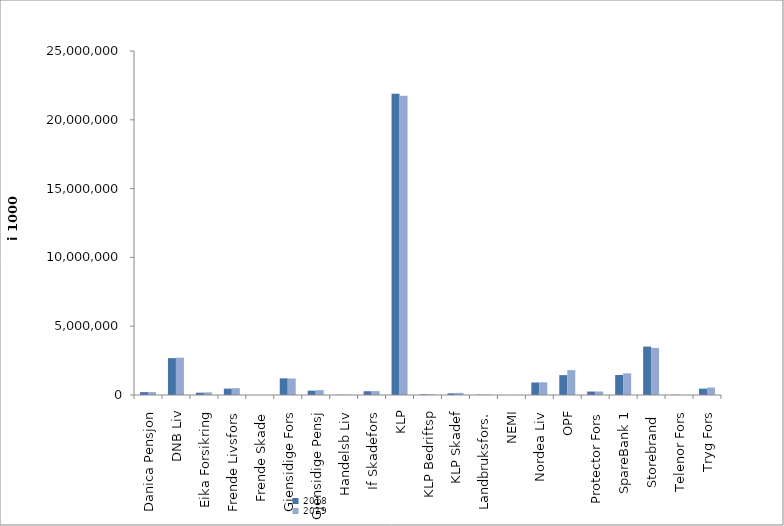
| Category | 2018 | 2019 |
|---|---|---|
| Danica Pensjon | 207699.397 | 211735.833 |
| DNB Liv | 2678691 | 2712593.897 |
| Eika Forsikring | 167974 | 192435 |
| Frende Livsfors | 461898 | 491921 |
| Frende Skade | 5092 | 1977 |
| Gjensidige Fors | 1211719 | 1200340 |
| Gjensidige Pensj | 315310 | 350587.6 |
| Handelsb Liv | 19122 | 18102 |
| If Skadefors | 273642.102 | 278836.821 |
| KLP | 21895155.245 | 21744313.455 |
| KLP Bedriftsp | 46821 | 47990 |
| KLP Skadef | 119515 | 154391 |
| Landbruksfors. | 23683 | 26907 |
| NEMI | 1012 | 9667.001 |
| Nordea Liv | 911121.951 | 924775.235 |
| OPF | 1444566 | 1806904 |
| Protector Fors | 251893.273 | 254608.636 |
| SpareBank 1 | 1452699.331 | 1574350.091 |
| Storebrand  | 3517282.228 | 3421913.84 |
| Telenor Fors | 20446 | 0 |
| Tryg Fors | 458835 | 543064 |